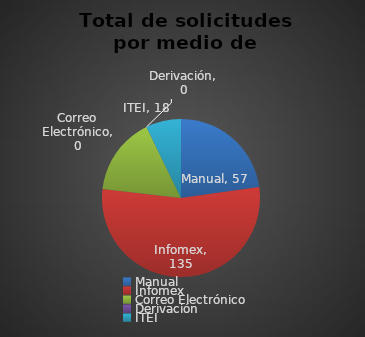
| Category | Series 0 |
|---|---|
| Manual | 57 |
| Infomex | 135 |
| Correo Electrónico | 40 |
| Derivación | 0 |
| ITEI | 18 |